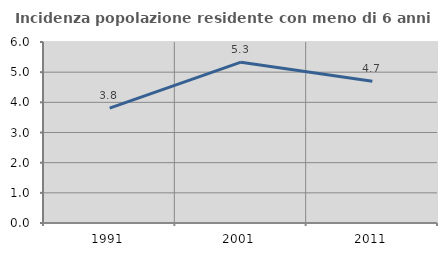
| Category | Incidenza popolazione residente con meno di 6 anni |
|---|---|
| 1991.0 | 3.808 |
| 2001.0 | 5.331 |
| 2011.0 | 4.702 |